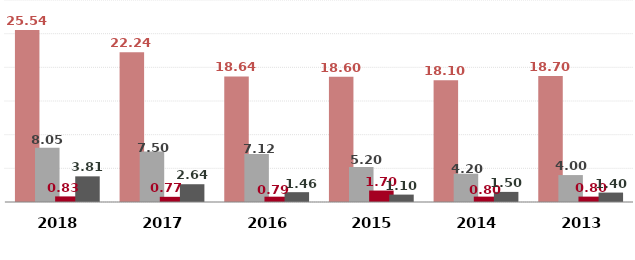
| Category | ضمان ائتمان الصادرات للمدى القصير | ضمان الائتمان المحلي للمدى القصير | ضمان ائتمان الصادرات للمدي المتوسط | ضمان الاستثمار |
|---|---|---|---|---|
| 2018.0 | 25.54 | 8.05 | 0.83 | 3.81 |
| 2017.0 | 22.24 | 7.5 | 0.77 | 2.64 |
| 2016.0 | 18.64 | 7.12 | 0.79 | 1.46 |
| 2015.0 | 18.6 | 5.2 | 1.7 | 1.1 |
| 2014.0 | 18.1 | 4.2 | 0.8 | 1.5 |
| 2013.0 | 18.7 | 4 | 0.8 | 1.4 |